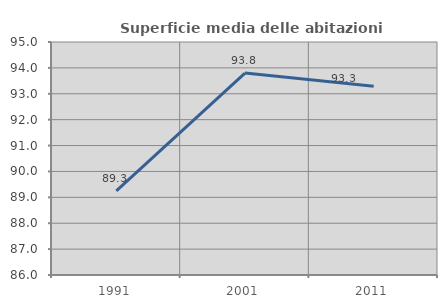
| Category | Superficie media delle abitazioni occupate |
|---|---|
| 1991.0 | 89.25 |
| 2001.0 | 93.8 |
| 2011.0 | 93.289 |